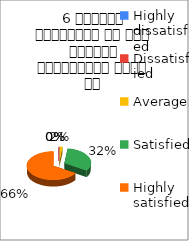
| Category | 6 शिक्षक समयनिष्ट है एवं नियमित व्याख्यान देते है  |
|---|---|
| Highly dissatisfied | 0 |
| Dissatisfied | 0 |
| Average | 1 |
| Satisfied | 17 |
| Highly satisfied | 35 |